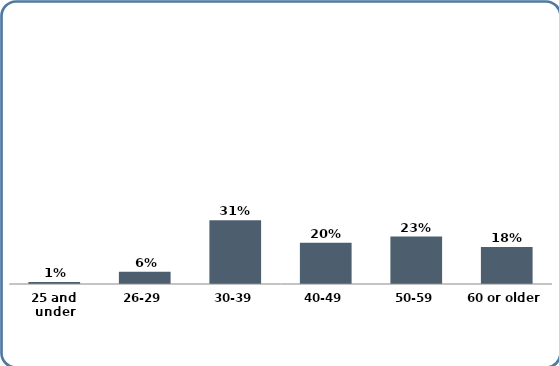
| Category | Series 0 |
|---|---|
| 25 and under | 0.01 |
| 26-29 | 0.06 |
| 30-39 | 0.31 |
| 40-49 | 0.2 |
| 50-59 | 0.23 |
| 60 or older | 0.18 |